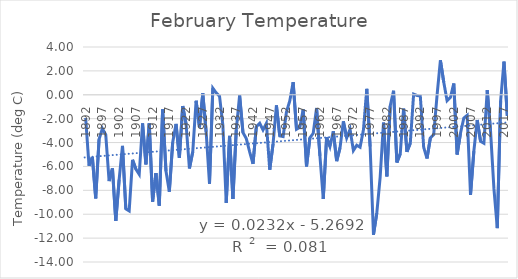
| Category | Series 0 |
|---|---|
| 1892.0 | -1.944 |
| 1893.0 | -5.944 |
| 1894.0 | -5.222 |
| 1895.0 | -8.667 |
| 1896.0 | -3.722 |
| 1897.0 | -2.833 |
| 1898.0 | -3.333 |
| 1899.0 | -7.222 |
| 1900.0 | -6.167 |
| 1901.0 | -10.556 |
| 1902.0 | -7.111 |
| 1903.0 | -4.278 |
| 1904.0 | -9.556 |
| 1905.0 | -9.722 |
| 1906.0 | -5.444 |
| 1907.0 | -6.222 |
| 1908.0 | -6.667 |
| 1909.0 | -2.389 |
| 1910.0 | -5.833 |
| 1911.0 | -2.389 |
| 1912.0 | -8.944 |
| 1913.0 | -6.556 |
| 1914.0 | -9.278 |
| 1915.0 | -1.222 |
| 1916.0 | -6.389 |
| 1917.0 | -8.111 |
| 1918.0 | -4 |
| 1919.0 | -2.444 |
| 1920.0 | -5.278 |
| 1921.0 | -0.944 |
| 1922.0 | -2.444 |
| 1923.0 | -6.167 |
| 1924.0 | -4.778 |
| 1925.0 | -0.5 |
| 1926.0 | -2.722 |
| 1927.0 | 0.111 |
| 1928.0 | -3.111 |
| 1929.0 | -7.444 |
| 1930.0 | 0.556 |
| 1931.0 | 0.167 |
| 1932.0 | -0.111 |
| 1933.0 | -2.556 |
| 1934.0 | -9.056 |
| 1935.0 | -3.444 |
| 1936.0 | -8.722 |
| 1937.0 | -2.944 |
| 1938.0 | -0.056 |
| 1939.0 | -3.167 |
| 1940.0 | -3.667 |
| 1941.0 | -4.778 |
| 1942.0 | -5.778 |
| 1943.0 | -2.667 |
| 1944.0 | -2.389 |
| 1945.0 | -2.944 |
| 1946.0 | -2.389 |
| 1947.0 | -6.278 |
| 1948.0 | -4.111 |
| 1949.0 | -0.889 |
| 1950.0 | -3.444 |
| 1951.0 | -3.5 |
| 1952.0 | -1.444 |
| 1953.0 | -0.5 |
| 1954.0 | 1.056 |
| 1955.0 | -2.889 |
| 1956.0 | -2.722 |
| 1957.0 | -1.222 |
| 1958.0 | -6 |
| 1959.0 | -3.611 |
| 1960.0 | -3.222 |
| 1961.0 | -1.111 |
| 1962.0 | -5.111 |
| 1963.0 | -8.722 |
| 1964.0 | -3.556 |
| 1965.0 | -4.333 |
| 1966.0 | -3.056 |
| 1967.0 | -5.556 |
| 1968.0 | -4.444 |
| 1969.0 | -2.222 |
| 1970.0 | -3.611 |
| 1971.0 | -2.889 |
| 1972.0 | -4.667 |
| 1973.0 | -4.222 |
| 1974.0 | -4.389 |
| 1975.0 | -2.944 |
| 1976.0 | 0.5 |
| 1977.0 | -4.333 |
| 1978.0 | -11.722 |
| 1979.0 | -9.889 |
| 1980.0 | -6.889 |
| 1981.0 | -2.333 |
| 1982.0 | -6.833 |
| 1983.0 | -0.944 |
| 1984.0 | 0.333 |
| 1985.0 | -5.667 |
| 1986.0 | -4.944 |
| 1987.0 | -1.167 |
| 1988.0 | -4.778 |
| 1989.0 | -4.056 |
| 1990.0 | 0.056 |
| 1991.0 | -0.056 |
| 1992.0 | -0.111 |
| 1993.0 | -4.389 |
| 1994.0 | -5.333 |
| 1995.0 | -3.611 |
| 1996.0 | -3.333 |
| 1997.0 | -0.056 |
| 1998.0 | 2.889 |
| 1999.0 | 1.056 |
| 2000.0 | -0.5 |
| 2001.0 | -0.222 |
| 2002.0 | 0.944 |
| 2003.0 | -5 |
| 2004.0 | -3.222 |
| 2005.0 | -1.944 |
| 2006.0 | -1.722 |
| 2007.0 | -8.389 |
| 2008.0 | -4.722 |
| 2009.0 | -2.111 |
| 2010.0 | -3.889 |
| 2011.0 | -4.056 |
| 2012.0 | 0.389 |
| 2013.0 | -3.111 |
| 2014.0 | -7.88 |
| 2015.0 | -11.167 |
| 2016.0 | -0.5 |
| 2017.0 | 2.778 |
| 2018.0 | -1.778 |